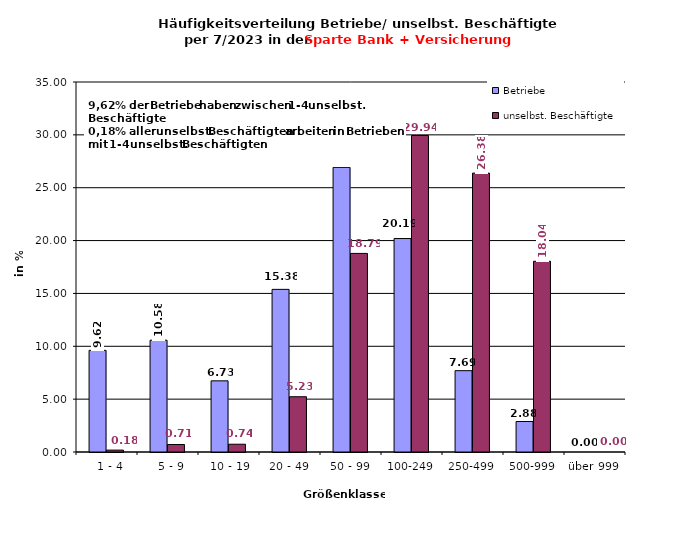
| Category | Betriebe | unselbst. Beschäftigte |
|---|---|---|
|   1 - 4 | 9.615 | 0.179 |
|   5 - 9 | 10.577 | 0.708 |
|  10 - 19 | 6.731 | 0.735 |
| 20 - 49 | 15.385 | 5.228 |
| 50 - 99 | 26.923 | 18.786 |
| 100-249 | 20.192 | 29.941 |
| 250-499 | 7.692 | 26.381 |
| 500-999 | 2.885 | 18.042 |
| über 999 | 0 | 0 |